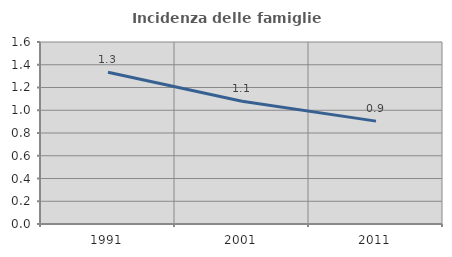
| Category | Incidenza delle famiglie numerose |
|---|---|
| 1991.0 | 1.335 |
| 2001.0 | 1.079 |
| 2011.0 | 0.904 |